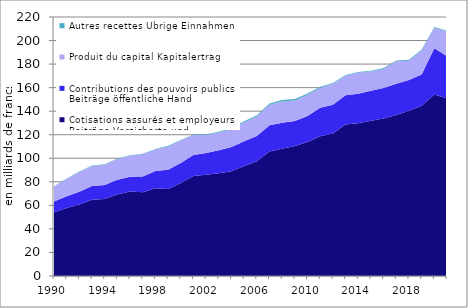
| Category | Cotisations assurés et employeurs | Contributions des pouvoirs publics | Produit du capital | Autres recettes |
|---|---|---|---|---|
| 1990.0 | 54.058 | 9.202 | 12.75 | 0.325 |
| 1991.0 | 57.775 | 9.934 | 14.671 | 0.429 |
| 1992.0 | 60.714 | 10.871 | 16.715 | 0.382 |
| 1993.0 | 64.852 | 11.56 | 17.023 | 0.398 |
| 1994.0 | 65.436 | 11.853 | 17.304 | 0.394 |
| 1995.0 | 69.317 | 12.454 | 17.581 | 0.398 |
| 1996.0 | 71.689 | 12.639 | 17.871 | 0.359 |
| 1997.0 | 71.181 | 13.359 | 18.931 | 0.448 |
| 1998.0 | 74.606 | 14.527 | 18.274 | 0.455 |
| 1999.0 | 73.916 | 16.333 | 19.852 | 0.576 |
| 2000.0 | 79.04 | 16.993 | 18.994 | 0.579 |
| 2001.0 | 84.956 | 17.845 | 16.894 | 0.519 |
| 2002.0 | 86.087 | 18.454 | 15.273 | 0.648 |
| 2003.0 | 87.248 | 19.517 | 15.176 | 0.566 |
| 2004.0 | 89.063 | 20.437 | 15.116 | 1.194 |
| 2005.0 | 93.415 | 21.124 | 15.91 | 1.011 |
| 2006.0 | 97.459 | 21.434 | 16.637 | 0.998 |
| 2007.0 | 105.76 | 22.355 | 17.258 | 1.119 |
| 2008.0 | 108.093 | 22.166 | 18.044 | 1.205 |
| 2009.0 | 110.467 | 21.241 | 17.383 | 1.218 |
| 2010.0 | 113.917 | 22.014 | 17.939 | 1.06 |
| 2011.0 | 118.684 | 24.264 | 16.973 | 0.735 |
| 2012.0 | 121.09 | 24.379 | 17.753 | 0.728 |
| 2013.0 | 128.703 | 24.767 | 16.662 | 0.665 |
| 2014.0 | 129.687 | 25.167 | 17.803 | 0.675 |
| 2015.0 | 131.849 | 25.502 | 16.297 | 0.66 |
| 2016.0 | 133.88 | 25.83 | 16.206 | 0.671 |
| 2017.0 | 136.837 | 26.358 | 19.295 | 0.616 |
| 2018.0 | 140.437 | 25.981 | 16.52 | 0.672 |
| 2019.0 | 144.678 | 26.457 | 20.447 | 0.823 |
| 2020.0 | 154.237 | 39.184 | 17.393 | 0.775 |
| 2021.0 | 150.891 | 35.815 | 20.992 | 0.501 |